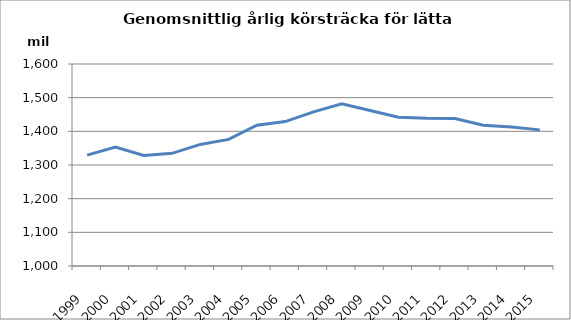
| Category | Series 0 |
|---|---|
| 1999.0 | 1329.255 |
| 2000.0 | 1353.485 |
| 2001.0 | 1328.518 |
| 2002.0 | 1334.573 |
| 2003.0 | 1361.115 |
| 2004.0 | 1376.162 |
| 2005.0 | 1418.08 |
| 2006.0 | 1428.927 |
| 2007.0 | 1457.956 |
| 2008.0 | 1481.997 |
| 2009.0 | 1462.097 |
| 2010.0 | 1441.784 |
| 2011.0 | 1438.714 |
| 2012.0 | 1437.942 |
| 2013.0 | 1418.184 |
| 2014.0 | 1412.603 |
| 2015.0 | 1404.319 |